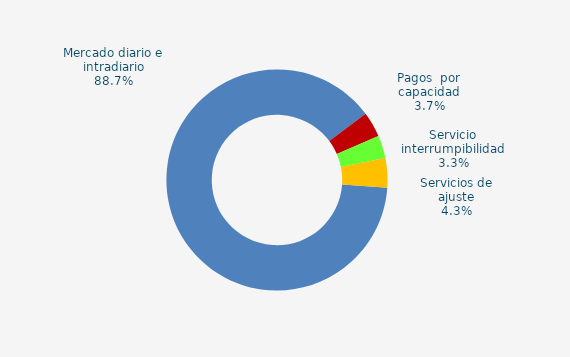
| Category | Series 0 |
|---|---|
| Mercado diario e intradiario | 57.6 |
| Pagos  por capacidad | 2.41 |
| Servicio interrumpibilidad | 2.16 |
| Servicios de ajuste | 2.79 |